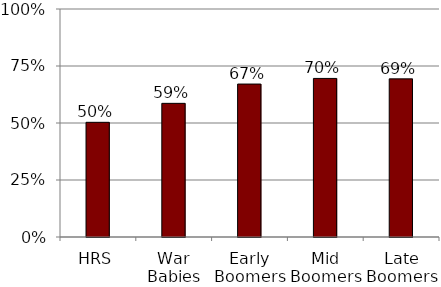
| Category | Women |
|---|---|
| 0 | 0.503 |
| 1 | 0.586 |
| 2 | 0.671 |
| 3 | 0.695 |
| 4 | 0.694 |